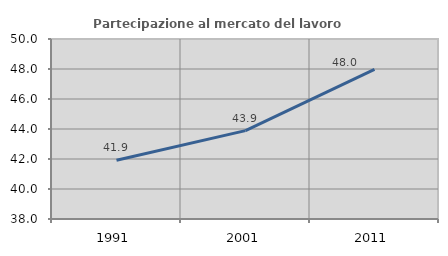
| Category | Partecipazione al mercato del lavoro  femminile |
|---|---|
| 1991.0 | 41.914 |
| 2001.0 | 43.89 |
| 2011.0 | 47.979 |